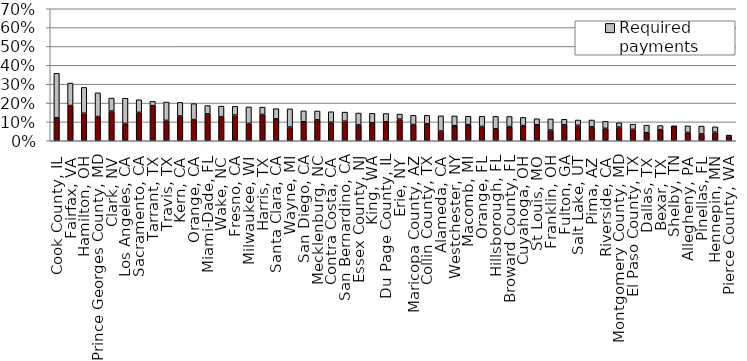
| Category | Current payments | Required payments |
|---|---|---|
| Cook County, IL | 0.122 | 0.236 |
| Fairfax, VA | 0.187 | 0.119 |
| Hamilton, OH | 0.146 | 0.137 |
| Prince Georges County, MD | 0.128 | 0.126 |
| Clark, NV | 0.157 | 0.069 |
| Los Angeles, CA | 0.092 | 0.133 |
| Sacramento, CA | 0.15 | 0.067 |
| Tarrant, TX | 0.186 | 0.023 |
| Travis, TX | 0.108 | 0.097 |
| Kern, CA | 0.131 | 0.072 |
| Orange, CA | 0.112 | 0.085 |
| Miami-Dade, FL | 0.143 | 0.044 |
| Wake, NC | 0.128 | 0.056 |
| Fresno, CA | 0.136 | 0.047 |
| Milwaukee, WI | 0.092 | 0.087 |
| Harris, TX | 0.14 | 0.039 |
| Santa Clara, CA | 0.116 | 0.054 |
| Wayne, MI | 0.073 | 0.096 |
| San Diego, CA | 0.101 | 0.058 |
| Mecklenburg, NC | 0.111 | 0.047 |
| Contra Costa, CA | 0.099 | 0.055 |
| San Bernardino, CA | 0.104 | 0.048 |
| Essex County, NJ | 0.084 | 0.063 |
| King, WA | 0.095 | 0.05 |
| Du Page County, IL | 0.101 | 0.044 |
| Erie, NY | 0.114 | 0.027 |
| Maricopa County, AZ | 0.086 | 0.049 |
| Collin County, TX | 0.091 | 0.044 |
| Alameda, CA | 0.052 | 0.08 |
| Westchester, NY | 0.08 | 0.052 |
| Macomb, MI | 0.085 | 0.045 |
| Orange, FL | 0.076 | 0.054 |
| Hillsborough, FL | 0.063 | 0.066 |
| Broward County, FL | 0.075 | 0.054 |
| Cuyahoga, OH | 0.08 | 0.044 |
| St Louis, MO | 0.085 | 0.032 |
| Franklin, OH | 0.057 | 0.059 |
| Fulton, GA | 0.085 | 0.029 |
| Salt Lake, UT | 0.082 | 0.028 |
| Pima, AZ | 0.074 | 0.036 |
| Riverside, CA | 0.066 | 0.037 |
| Montgomery County, MD | 0.072 | 0.023 |
| El Paso County, TX | 0.06 | 0.027 |
| Dallas, TX | 0.043 | 0.04 |
| Bexar, TX | 0.059 | 0.021 |
| Shelby, TN | 0.08 | 0 |
| Allegheny, PA | 0.044 | 0.035 |
| Pinellas, FL | 0.036 | 0.041 |
| Hennepin, MN | 0.045 | 0.029 |
| Pierce County, WA | 0.026 | 0.004 |